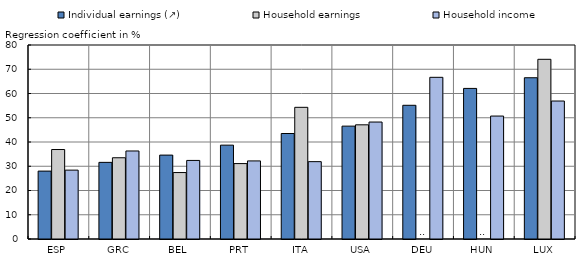
| Category | Individual earnings (↗) | Household earnings | Household income |
|---|---|---|---|
| ESP | 28 | 36.9 | 28.4 |
| GRC | 31.6 | 33.5 | 36.3 |
| BEL | 34.6 | 27.4 | 32.4 |
| PRT | 38.7 | 31.1 | 32.2 |
| ITA | 43.5 | 54.3 | 31.9 |
| USA | 46.544 | 47.086 | 48.228 |
| DEU | 55.139 | 0 | 66.674 |
| HUN | 62.1 | 0 | 50.7 |
| LUX | 66.5 | 74.1 | 56.9 |